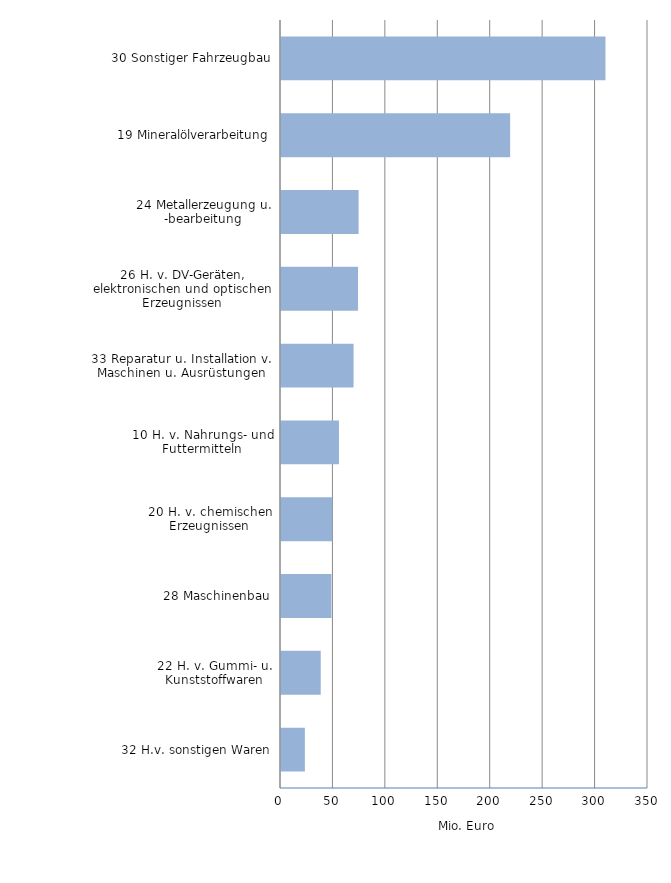
| Category | Series 1 |
|---|---|
| 32 H.v. sonstigen Waren | 22.771 |
| 22 H. v. Gummi- u. Kunststoffwaren | 37.894 |
| 28 Maschinenbau | 48.105 |
| 20 H. v. chemischen Erzeugnissen | 48.837 |
| 10 H. v. Nahrungs- und Futtermitteln | 55.288 |
| 33 Reparatur u. Installation v. Maschinen u. Ausrüstungen | 69.189 |
| 26 H. v. DV-Geräten, elektronischen und optischen Erzeugnissen | 73.482 |
| 24 Metallerzeugung u. -bearbeitung | 74.015 |
| 19 Mineralölverarbeitung | 218.507 |
| 30 Sonstiger Fahrzeugbau | 309.434 |